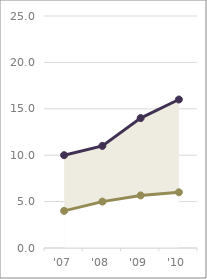
| Category | Choc | Bisc |
|---|---|---|
| '07 | 10 | 4 |
| '08 | 11 | 5 |
| '09 | 14 | 5.667 |
| '10 | 16 | 6 |